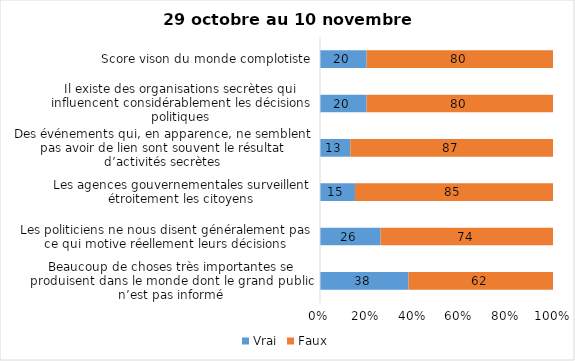
| Category | Vrai | Faux |
|---|---|---|
| Beaucoup de choses très importantes se produisent dans le monde dont le grand public n’est pas informé | 38 | 62 |
| Les politiciens ne nous disent généralement pas ce qui motive réellement leurs décisions | 26 | 74 |
| Les agences gouvernementales surveillent étroitement les citoyens | 15 | 85 |
| Des événements qui, en apparence, ne semblent pas avoir de lien sont souvent le résultat d’activités secrètes | 13 | 87 |
| Il existe des organisations secrètes qui influencent considérablement les décisions politiques | 20 | 80 |
| Score vison du monde complotiste | 20 | 80 |